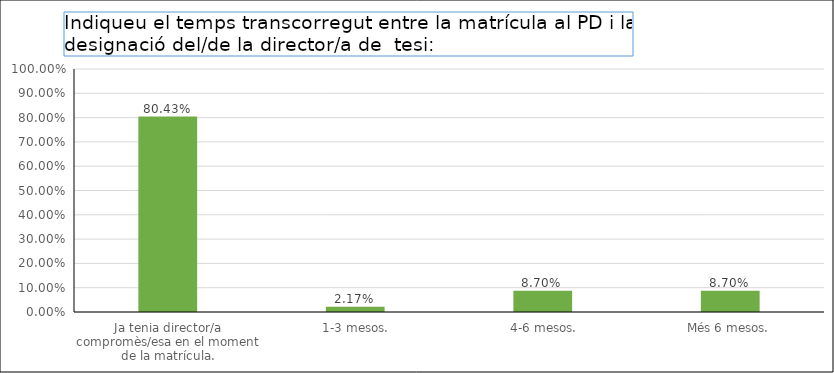
| Category | Series 0 |
|---|---|
| Ja tenia director/a compromès/esa en el moment de la matrícula. | 0.804 |
|  1-3 mesos. | 0.022 |
|  4-6 mesos. | 0.087 |
| Més 6 mesos. | 0.087 |